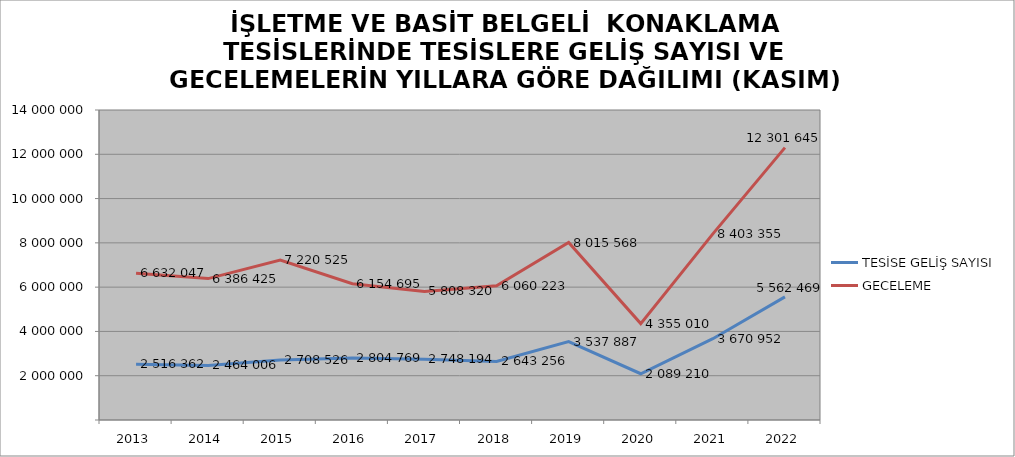
| Category | TESİSE GELİŞ SAYISI | GECELEME |
|---|---|---|
| 2013 | 2516362 | 6632047 |
| 2014 | 2464006 | 6386425 |
| 2015 | 2708526 | 7220525 |
| 2016 | 2804769 | 6154695 |
| 2017 | 2748194 | 5808320 |
| 2018 | 2643256 | 6060223 |
| 2019 | 3537887 | 8015568 |
| 2020 | 2089210 | 4355010 |
| 2021 | 3670952 | 8403355 |
| 2022 | 5562469 | 12301645 |